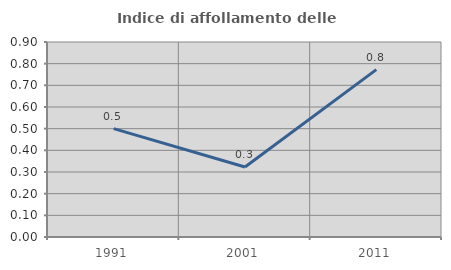
| Category | Indice di affollamento delle abitazioni  |
|---|---|
| 1991.0 | 0.5 |
| 2001.0 | 0.323 |
| 2011.0 | 0.773 |